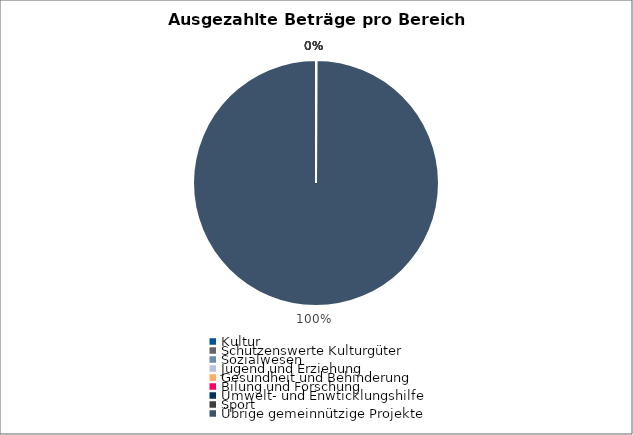
| Category | Series 0 |
|---|---|
| Kultur | 0 |
| Schützenswerte Kulturgüter | 0 |
| Sozialwesen | 0 |
| Jugend und Erziehung | 0 |
| Gesundheit und Behinderung | 0 |
| Bilung und Forschung | 0 |
| Umwelt- und Enwticklungshilfe | 0 |
| Sport | 0 |
| Übrige gemeinnützige Projekte | 30000 |